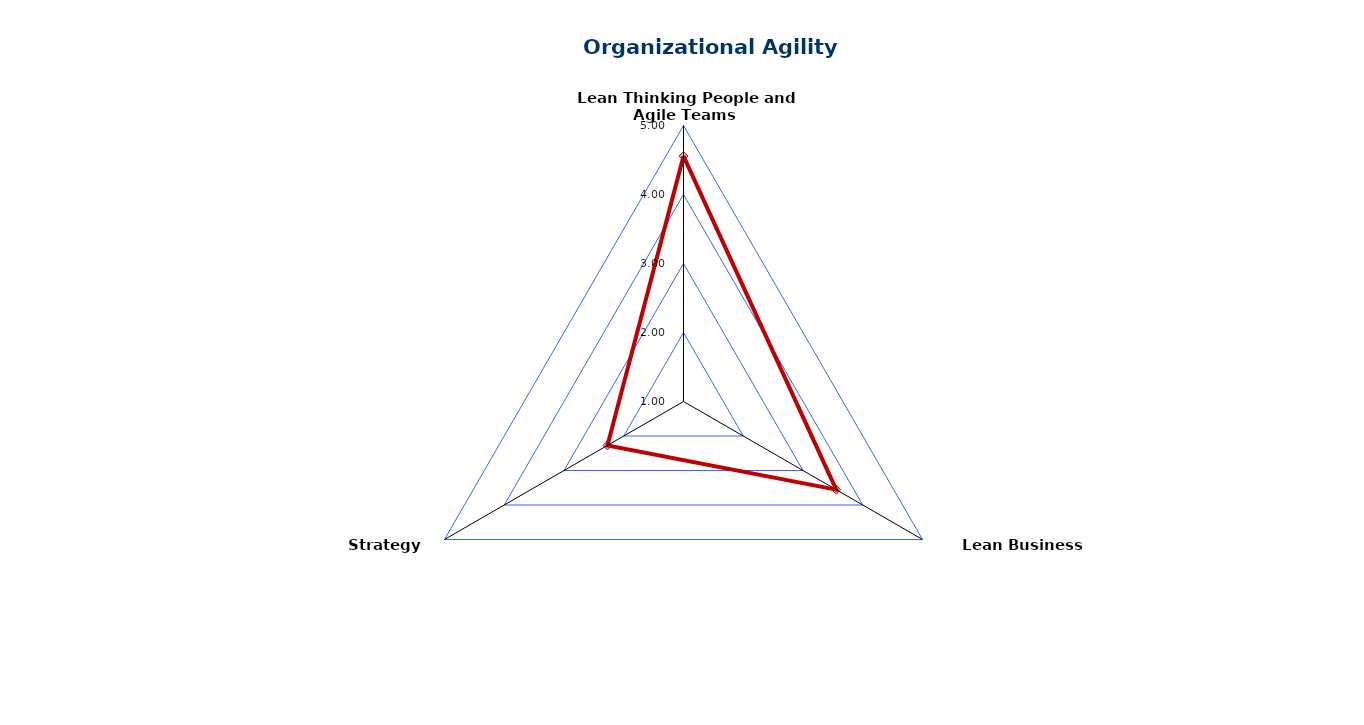
| Category | Organizational Agility Self-Assessment |
|---|---|
| Lean Thinking People and Agile Teams | 4.556 |
| Lean Business Operations | 3.556 |
| Strategy Agility | 2.273 |